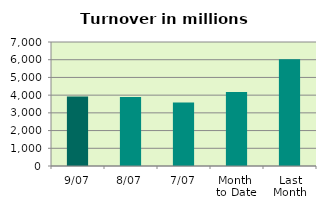
| Category | Series 0 |
|---|---|
| 9/07 | 3928.5 |
| 8/07 | 3891.259 |
| 7/07 | 3581.047 |
| Month 
to Date | 4176.993 |
| Last
Month | 6026.772 |